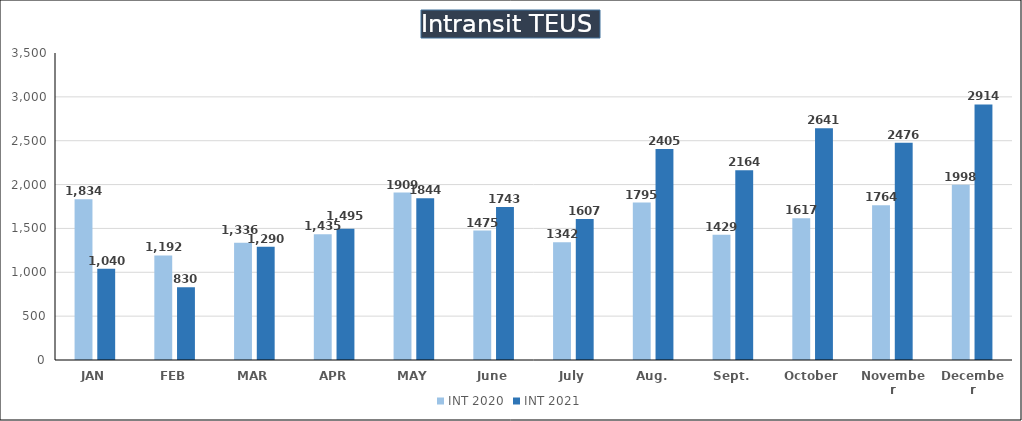
| Category | INT 2020 | INT 2021 |
|---|---|---|
| JAN | 1834 | 1040 |
| FEB | 1192 | 830 |
| MAR | 1336 | 1290 |
| APR | 1435 | 1495 |
| MAY | 1909 | 1844 |
| June | 1475 | 1743 |
| July | 1342 | 1607 |
| Aug. | 1795 | 2405 |
| Sept. | 1429 | 2164 |
| October | 1617 | 2641 |
| November | 1764 | 2476 |
| December | 1998 | 2914 |